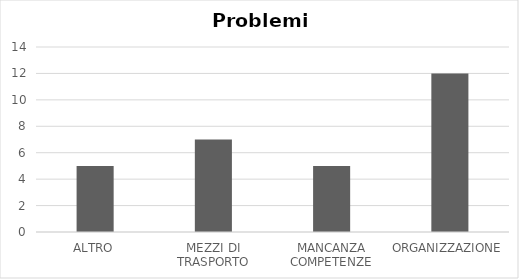
| Category | Series 0 |
|---|---|
| ALTRO | 5 |
| MEZZI DI TRASPORTO | 7 |
| MANCANZA COMPETENZE | 5 |
| ORGANIZZAZIONE | 12 |